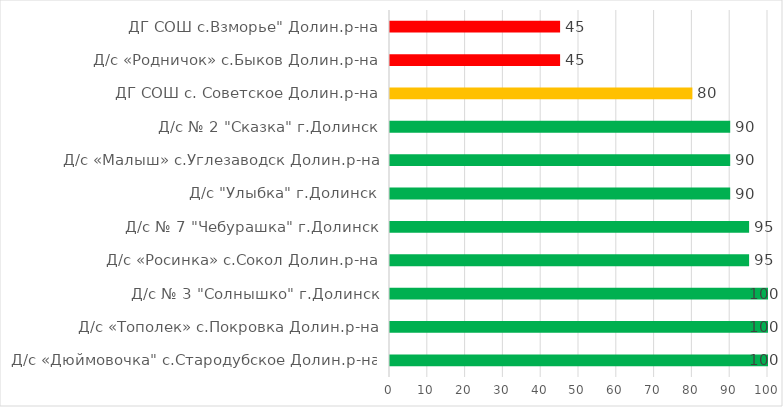
| Category | Series 0 |
|---|---|
| Д/с «Дюймовочка" с.Стародубское Долин.р-на | 100 |
| Д/с «Тополек» с.Покровка Долин.р-на | 100 |
| Д/с № 3 "Солнышко" г.Долинск | 100 |
| Д/с «Росинка» с.Сокол Долин.р-на | 95 |
| Д/с № 7 "Чебурашка" г.Долинск | 95 |
| Д/с "Улыбка" г.Долинск | 90 |
| Д/с «Малыш» с.Углезаводск Долин.р-на | 90 |
| Д/с № 2 "Сказка" г.Долинск | 90 |
| ДГ СОШ с. Советское Долин.р-на | 80 |
| Д/с «Родничок» с.Быков Долин.р-на | 45 |
| ДГ СОШ с.Взморье" Долин.р-на | 45 |